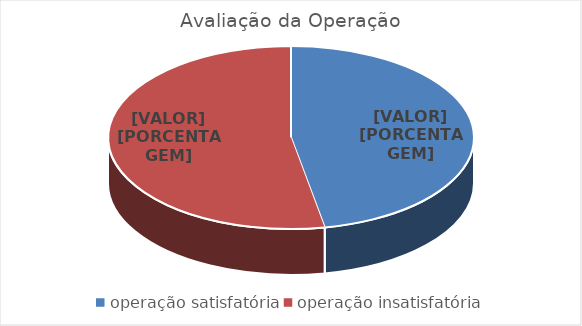
| Category | Avaliação da Operação |
|---|---|
| operação satisfatória | 8 |
| operação insatisfatória | 9 |